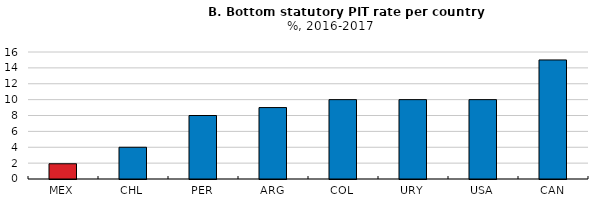
| Category | Minimum marginal rate |
|---|---|
| MEX | 1.92 |
| CHL | 4 |
| PER | 8 |
| ARG | 9 |
| COL | 10 |
| URY | 10 |
| USA | 10 |
| CAN | 15 |